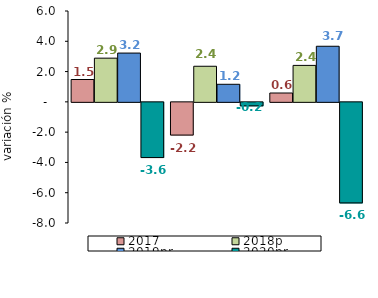
| Category | 2017 | 2018p | 2019pr | 2020pr |
|---|---|---|---|---|
| 0 | 1.476 | 2.886 | 3.222 | -3.647 |
| 1 | -2.16 | 2.351 | 1.16 | -0.231 |
| 2 | 0.584 | 2.407 | 3.672 | -6.641 |